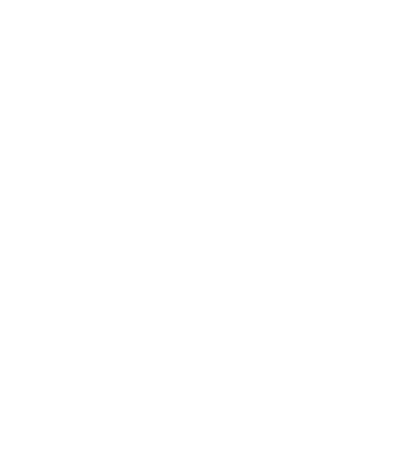
| Category | Total |
|---|---|
| Other 2 | 0 |
| Other 3 | 0 |
| Other 4 | 0 |
| Commissions/bonus | 5000 |
| Other 1 | 30000 |
| Salary | 90000 |